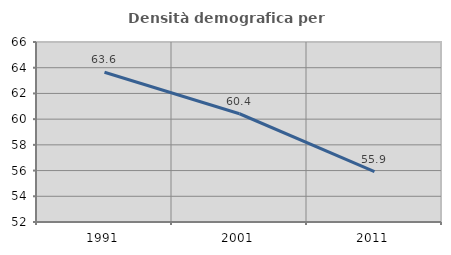
| Category | Densità demografica |
|---|---|
| 1991.0 | 63.645 |
| 2001.0 | 60.419 |
| 2011.0 | 55.923 |